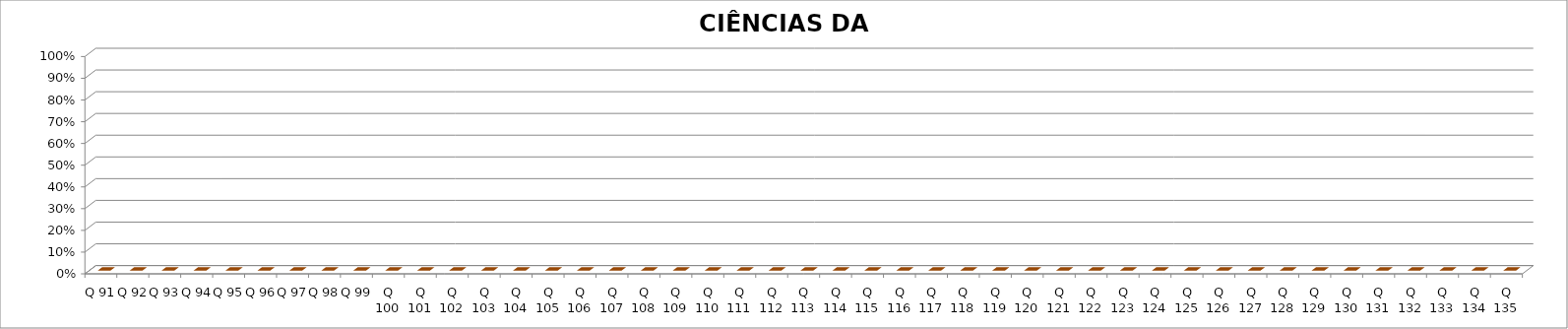
| Category | CIÊNCIAS DA NATUREZA |
|---|---|
| Q 91 | 0 |
| Q 92 | 0 |
| Q 93 | 0 |
| Q 94 | 0 |
| Q 95 | 0 |
| Q 96 | 0 |
| Q 97 | 0 |
| Q 98 | 0 |
| Q 99 | 0 |
| Q 100 | 0 |
| Q 101 | 0 |
| Q 102 | 0 |
| Q 103 | 0 |
| Q 104 | 0 |
| Q 105 | 0 |
| Q 106 | 0 |
| Q 107 | 0 |
| Q 108 | 0 |
| Q 109 | 0 |
| Q 110 | 0 |
| Q 111 | 0 |
| Q 112 | 0 |
| Q 113 | 0 |
| Q 114 | 0 |
| Q 115 | 0 |
| Q 116 | 0 |
| Q 117 | 0 |
| Q 118 | 0 |
| Q 119 | 0 |
| Q 120 | 0 |
| Q 121 | 0 |
| Q 122 | 0 |
| Q 123 | 0 |
| Q 124 | 0 |
| Q 125 | 0 |
| Q 126 | 0 |
| Q 127 | 0 |
| Q 128 | 0 |
| Q 129 | 0 |
| Q 130 | 0 |
| Q 131 | 0 |
| Q 132 | 0 |
| Q 133 | 0 |
| Q 134 | 0 |
| Q 135 | 0 |